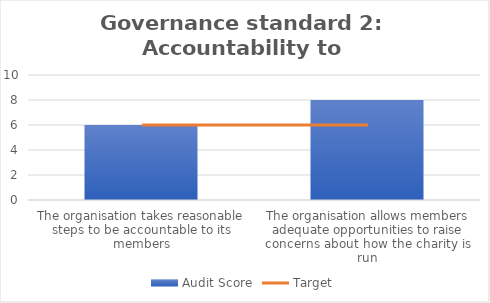
| Category | Audit Score |
|---|---|
| The organisation takes reasonable steps to be accountable to its members | 6 |
| The organisation allows members adequate opportunities to raise concerns about how the charity is run | 8 |